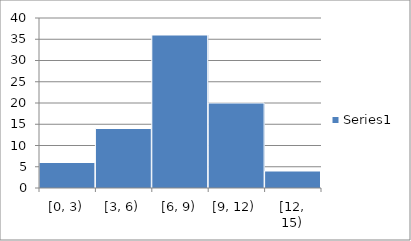
| Category | Series 0 |
|---|---|
| [0, 3) | 6 |
| [3, 6) | 14 |
| [6, 9) | 36 |
| [9, 12) | 20 |
| [12, 15) | 4 |